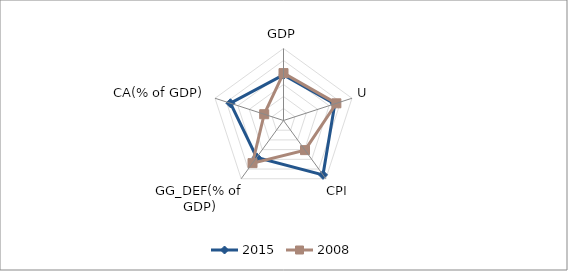
| Category | 2015 | 2008 |
|---|---|---|
| GDP | 7.6 | 7.9 |
| U | 8.996 | 9.264 |
| CPI | 11.2 | 6.1 |
| GG_DEF(% of GDP) | 7.6 | 8.785 |
| CA(% of GDP) | 9.3 | 3.384 |